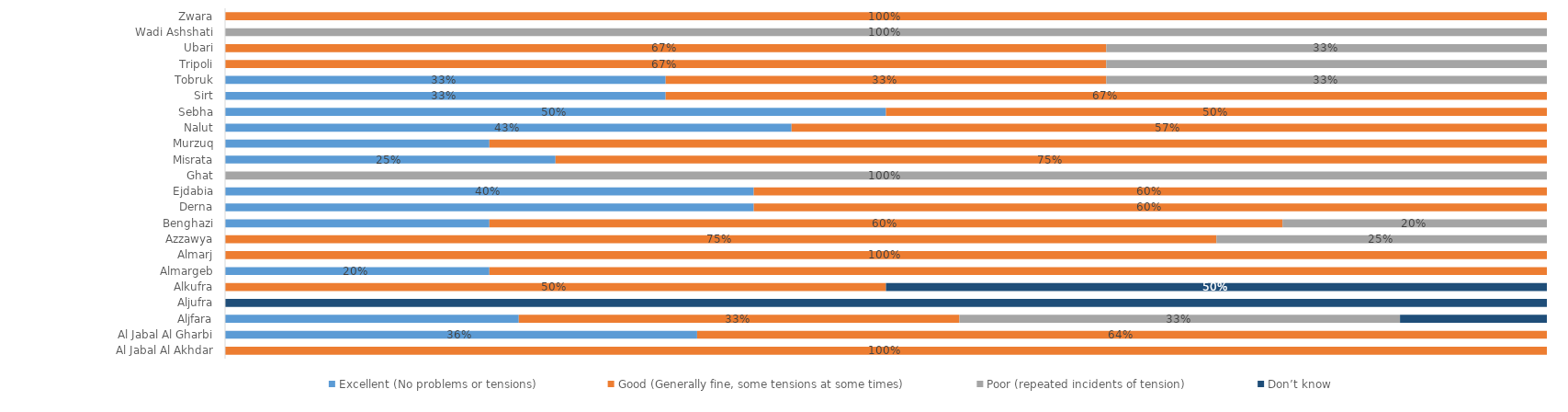
| Category | Excellent (No problems or tensions) | Good (Generally fine, some tensions at some times) | Poor (repeated incidents of tension) | Don’t know |
|---|---|---|---|---|
| Al Jabal Al Akhdar | 0 | 1 | 0 | 0 |
| Al Jabal Al Gharbi | 0.357 | 0.643 | 0 | 0 |
| Aljfara | 0.222 | 0.333 | 0.333 | 0.111 |
| Aljufra | 0 | 0 | 0 | 1 |
| Alkufra | 0 | 0.5 | 0 | 0.5 |
| Almargeb | 0.2 | 0.8 | 0 | 0 |
| Almarj | 0 | 1 | 0 | 0 |
| Azzawya | 0 | 0.75 | 0.25 | 0 |
| Benghazi | 0.2 | 0.6 | 0.2 | 0 |
| Derna | 0.4 | 0.6 | 0 | 0 |
| Ejdabia | 0.4 | 0.6 | 0 | 0 |
| Ghat | 0 | 0 | 1 | 0 |
| Misrata | 0.25 | 0.75 | 0 | 0 |
| Murzuq | 0.2 | 0.8 | 0 | 0 |
| Nalut | 0.429 | 0.571 | 0 | 0 |
| Sebha | 0.5 | 0.5 | 0 | 0 |
| Sirt | 0.333 | 0.667 | 0 | 0 |
| Tobruk | 0.333 | 0.333 | 0.333 | 0 |
| Tripoli | 0 | 0.667 | 0.333 | 0 |
| Ubari | 0 | 0.667 | 0.333 | 0 |
| Wadi Ashshati | 0 | 0 | 1 | 0 |
| Zwara | 0 | 1 | 0 | 0 |